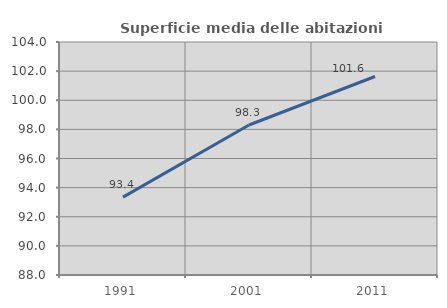
| Category | Superficie media delle abitazioni occupate |
|---|---|
| 1991.0 | 93.35 |
| 2001.0 | 98.299 |
| 2011.0 | 101.631 |